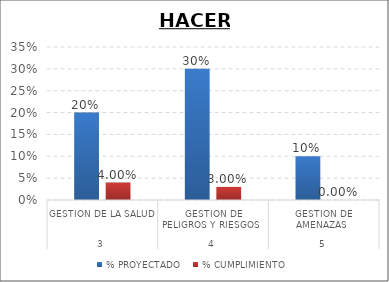
| Category | % PROYECTADO | % CUMPLIMIENTO |
|---|---|---|
| 0 | 0.2 | 0.04 |
| 1 | 0.3 | 0.03 |
| 2 | 0.1 | 0 |